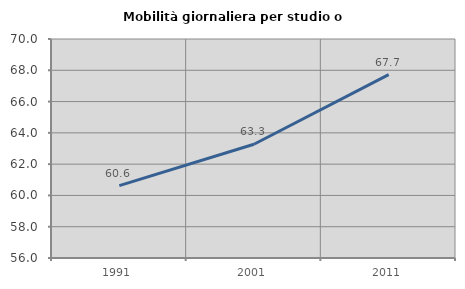
| Category | Mobilità giornaliera per studio o lavoro |
|---|---|
| 1991.0 | 60.63 |
| 2001.0 | 63.274 |
| 2011.0 | 67.719 |